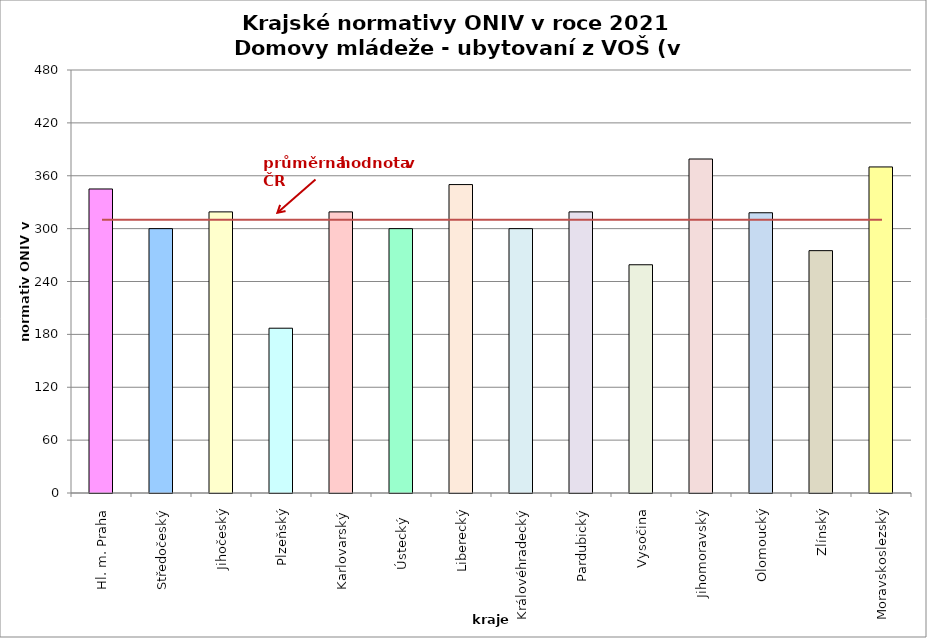
| Category | Series 0 |
|---|---|
| Hl. m. Praha | 345 |
| Středočeský | 300 |
| Jihočeský | 319 |
| Plzeňský | 187 |
| Karlovarský  | 319 |
| Ústecký   | 300 |
| Liberecký | 350 |
| Královéhradecký | 300 |
| Pardubický | 319 |
| Vysočina | 259 |
| Jihomoravský | 379 |
| Olomoucký | 318 |
| Zlínský | 275 |
| Moravskoslezský | 370 |